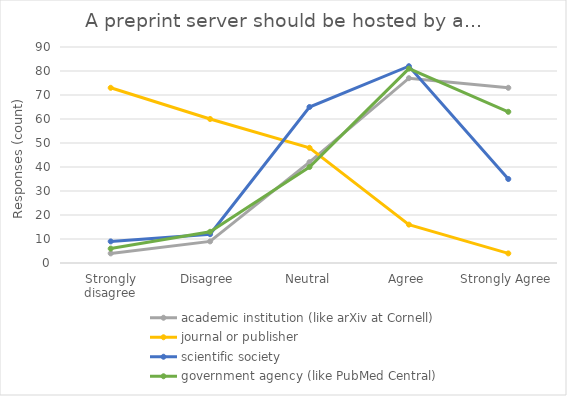
| Category | academic institution (like arXiv at Cornell) | journal or publisher | scientific society | government agency (like PubMed Central) |
|---|---|---|---|---|
| Strongly disagree | 4 | 73 | 9 | 6 |
| Disagree | 9 | 60 | 12 | 13 |
| Neutral | 42 | 48 | 65 | 40 |
| Agree | 77 | 16 | 82 | 81 |
| Strongly Agree | 73 | 4 | 35 | 63 |